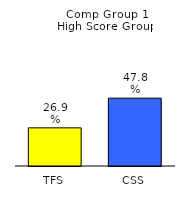
| Category | Series 0 |
|---|---|
| TFS | 0.269 |
| CSS | 0.478 |